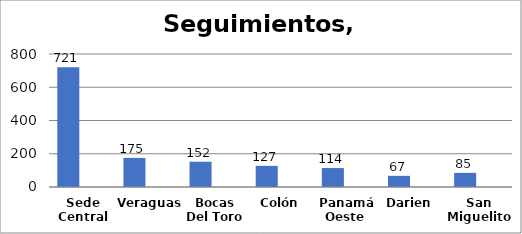
| Category | Series 0 | Series 1 |
|---|---|---|
| Sede Central | 721 |  |
| Veraguas  | 175 |  |
| Bocas Del Toro | 152 |  |
| Colón | 127 |  |
| Panamá Oeste  | 114 |  |
| Darien  | 67 |  |
| San Miguelito | 85 |  |